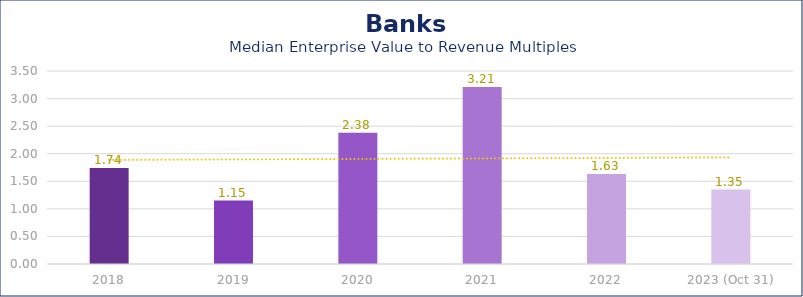
| Category | Banks |
|---|---|
| 2018 | 1.74 |
| 2019 | 1.15 |
| 2020 | 2.38 |
| 2021 | 3.21 |
| 2022 | 1.63 |
| 2023 (Oct 31) | 1.35 |